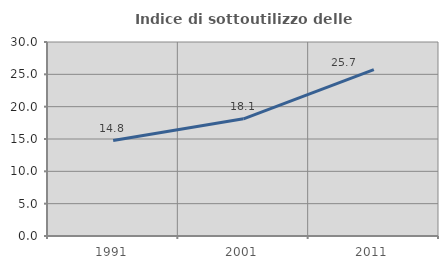
| Category | Indice di sottoutilizzo delle abitazioni  |
|---|---|
| 1991.0 | 14.752 |
| 2001.0 | 18.12 |
| 2011.0 | 25.725 |